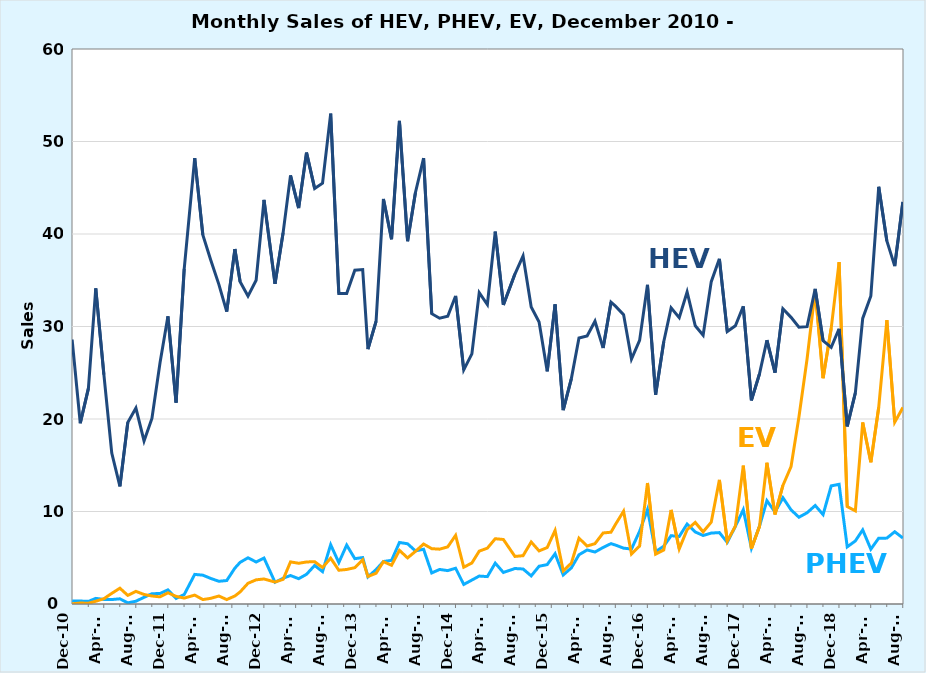
| Category | PHEV | BEV | HEV |
|---|---|---|---|
| 2010-12-01 | 326 | 19 | 28592 |
| 2011-01-01 | 321 | 103 | 19540 |
| 2011-02-01 | 281 | 83 | 23306 |
| 2011-03-01 | 608 | 298 | 34126 |
| 2011-04-01 | 493 | 573 | 24802 |
| 2011-05-01 | 481 | 1150 | 16319 |
| 2011-06-01 | 561 | 1708 | 12714 |
| 2011-07-01 | 125 | 932 | 19621 |
| 2011-08-01 | 302 | 1363 | 21181 |
| 2011-09-01 | 723 | 1031 | 17625 |
| 2011-10-01 | 1108 | 866 | 20057 |
| 2011-11-01 | 1139 | 773 | 26110 |
| 2011-12-01 | 1529 | 1212 | 31100 |
| 2012-01-01 | 603 | 824 | 21779 |
| 2012-02-01 | 1023 | 639 | 36222 |
| 2012-03-12 | 3200 | 961 | 48206 |
| 2012-04-12 | 3116 | 479 | 39901 |
| 2012-05-12 | 2766 | 612 | 37184 |
| 2012-06-12 | 2455 | 863 | 34558 |
| 2012-07-12 | 2537 | 479 | 31611 |
| 2012-08-12 | 3878 | 866 | 38369 |
| 2012-09-01 | 4503 | 1306 | 34836 |
| 2012-10-01 | 4994 | 2238 | 33290 |
| 2012-11-01 | 4544 | 2614 | 35002 |
| 2012-12-01 | 4965 | 2704 | 43690 |
| 2013-01-12 | 2354 | 2372 | 34611 |
| 2013-02-12 | 2789 | 2666 | 40173 |
| 2013-03-12 | 3079 | 4553 | 46327 |
| 2013-04-12 | 2735 | 4403 | 42804 |
| 2013-05-12 | 3209 | 4545 | 48796 |
| 2013-06-12 | 4169 | 4573 | 44924 |
| 2013-07-12 | 3499 | 3943 | 45494 |
| 2013-08-12 | 6407 | 4956 | 53020 |
| 2013-09-12 | 4477 | 3650 | 33576 |
| 2013-10-12 | 6367 | 3733 | 33565 |
| 2013-11-12 | 4903 | 3930 | 36085 |
| 2013-12-12 | 5020 | 4770 | 36155 |
| 2014-01-01 | 2934 | 2971 | 27555 |
| 2014-02-01 | 3721 | 3324 | 30561 |
| 2014-03-01 | 4594 | 4578 | 43790 |
| 2014-04-01 | 4718 | 4187 | 39430 |
| 2014-05-01 | 6651 | 5802 | 52227 |
| 2014-06-01 | 6511 | 4982 | 39225 |
| 2014-07-01 | 5740 | 5693 | 44488 |
| 2014-08-01 | 5920 | 6483 | 48208 |
| 2014-09-01 | 3357 | 5983 | 31385 |
| 2014-10-01 | 3735 | 5927 | 30892 |
| 2014-11-01 | 3609 | 6176 | 31109 |
| 2014-12-01 | 3867 | 7419 | 33302 |
| 2015-01-01 | 2113 | 3977 | 25312 |
| 2015-02-01 | 2589 | 4435 | 27038 |
| 2015-03-01 | 3020 | 5715 | 33654 |
| 2015-04-01 | 2962 | 6037 | 32379 |
| 2015-05-01 | 4416 | 7057 | 40257 |
| 2015-06-01 | 3409 | 6975 | 32330 |
| 2015-07-15 | 3836 | 5143 | 35666 |
| 2015-08-15 | 3786 | 5224 | 37633 |
| 2015-09-15 | 3038 | 6704 | 32106 |
| 2015-10-15 | 4081 | 5740 | 30485 |
| 2015-11-15 | 4260 | 6103 | 25153 |
| 2015-12-15 | 5434 | 7954 | 32387 |
| 2016-01-15 | 3137 | 3576 | 20967 |
| 2016-02-15 | 3909 | 4424 | 24371 |
| 2016-03-15 | 5319 | 7115 | 28756 |
| 2016-04-15 | 5842 | 6266 | 28988 |
| 2016-05-15 | 5619 | 6526 | 30573 |
| 2016-06-15 | 6113 | 7678 | 27681 |
| 2016-07-15 | 6525 | 7762 | 32633 |
| 2016-08-01 | 6372 | 8601 | 32206 |
| 2016-09-01 | 6037 | 10032 | 31286 |
| 2016-10-01 | 5943 | 5408 | 26484 |
| 2016-11-01 | 7858 | 6266 | 28497 |
| 2016-12-01 | 10211 | 13077 | 34507 |
| 2017-01-01 | 5657 | 5398 | 22630 |
| 2017-02-01 | 6247 | 5846 | 28355 |
| 2017-03-01 | 7384 | 10171 | 32012 |
| 2017-04-01 | 7300 | 5961 | 30949 |
| 2017-05-01 | 8645 | 8038 | 33729 |
| 2017-06-01 | 7787 | 8814 | 30073 |
| 2017-07-01 | 7407 | 7802 | 29050 |
| 2017-08-01 | 7668 | 8850 | 34850 |
| 2017-09-01 | 7719 | 13421 | 37319 |
| 2017-10-01 | 6665 | 6792 | 29451 |
| 2017-11-01 | 8403 | 8440 | 30075 |
| 2017-12-01 | 10190 | 14959 | 32187 |
| 2018-01-01 | 6026 | 5984 | 22017 |
| 2018-02-01 | 8433 | 8412 | 24900 |
| 2018-03-01 | 11170 | 15273 | 28518 |
| 2018-04-01 | 9938 | 9685 | 25019 |
| 2018-05-01 | 11486 | 12822 | 31918 |
| 2018-06-01 | 10175 | 14860 | 30989 |
| 2018-07-01 | 9381 | 20217 | 29920 |
| 2018-08-01 | 9862 | 26485 | 29982 |
| 2018-09-01 | 10648 | 33896 | 34070 |
| 2018-10-01 | 9665 | 24409 | 28462 |
| 2018-11-01 | 12769 | 29819 | 27737 |
| 2018-12-01 | 12939 | 36961 | 29753 |
| 2019-01-01 | 6176 | 10539 | 19202 |
| 2019-02-01 | 6819 | 10072 | 22825 |
| 2019-03-01 | 8010 | 19629 | 30873 |
| 2019-04-01 | 5928 | 15327 | 33303 |
| 2019-05-01 | 7117 | 21269 | 45098 |
| 2019-06-01 | 7122 | 30696 | 39253 |
| 2019-07-01 | 7812 | 19658 | 36531 |
| 2019-08-01 | 7131 | 21239 | 43462 |